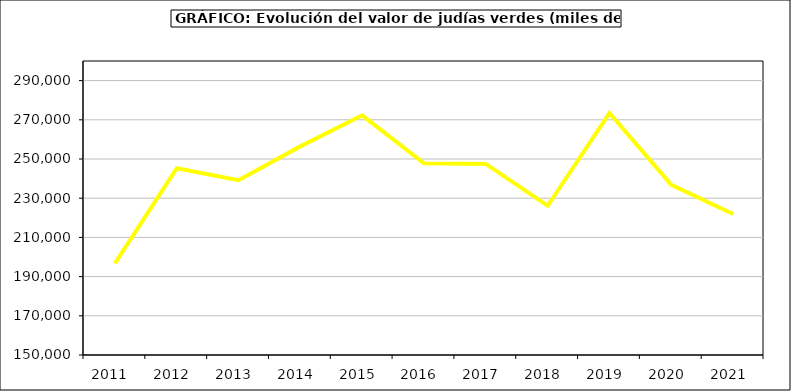
| Category | Valor |
|---|---|
| 2011.0 | 196749.281 |
| 2012.0 | 245279.866 |
| 2013.0 | 239211.036 |
| 2014.0 | 256441.694 |
| 2015.0 | 272296 |
| 2016.0 | 247800 |
| 2017.0 | 247502.748 |
| 2018.0 | 226142.115 |
| 2019.0 | 273438.399 |
| 2020.0 | 236840.402 |
| 2021.0 | 221942.842 |